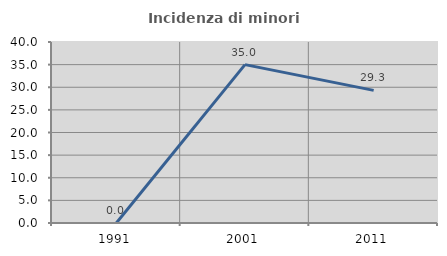
| Category | Incidenza di minori stranieri |
|---|---|
| 1991.0 | 0 |
| 2001.0 | 35 |
| 2011.0 | 29.31 |